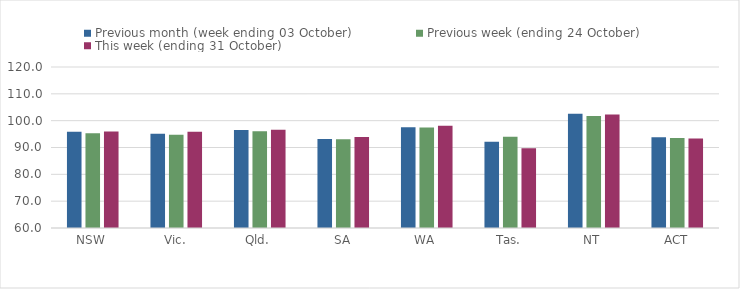
| Category | Previous month (week ending 03 October) | Previous week (ending 24 October) | This week (ending 31 October) |
|---|---|---|---|
| NSW | 95.85 | 95.32 | 95.98 |
| Vic. | 95.13 | 94.79 | 95.83 |
| Qld. | 96.49 | 96.08 | 96.65 |
| SA | 93.19 | 93.04 | 93.91 |
| WA | 97.51 | 97.47 | 98.13 |
| Tas. | 92.1 | 94.05 | 89.74 |
| NT | 102.58 | 101.72 | 102.29 |
| ACT | 93.86 | 93.58 | 93.33 |